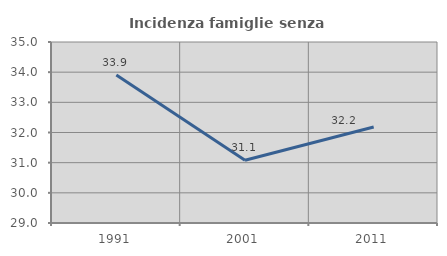
| Category | Incidenza famiglie senza nuclei |
|---|---|
| 1991.0 | 33.905 |
| 2001.0 | 31.081 |
| 2011.0 | 32.182 |